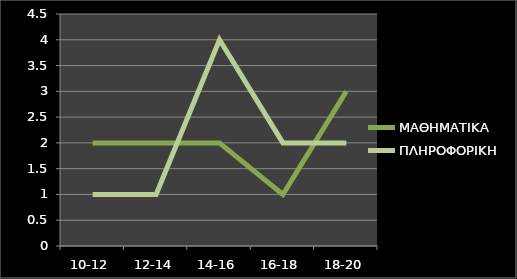
| Category | ΜΑΘΗΜΑΤΙΚΑ | ΠΛΗΡΟΦΟΡΙΚΗ |
|---|---|---|
| 10-12 | 2 | 1 |
| 12-14 | 2 | 1 |
| 14-16 | 2 | 4 |
| 16-18 | 1 | 2 |
| 18-20 | 3 | 2 |